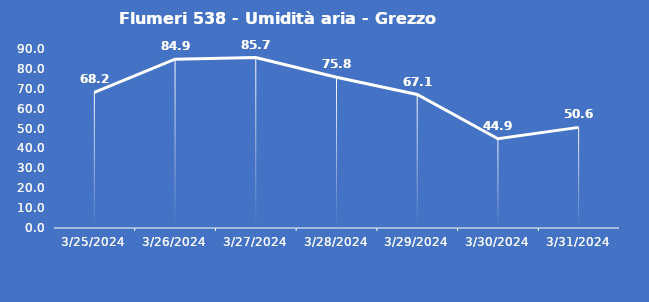
| Category | Flumeri 538 - Umidità aria - Grezzo (%) |
|---|---|
| 3/25/24 | 68.2 |
| 3/26/24 | 84.9 |
| 3/27/24 | 85.7 |
| 3/28/24 | 75.8 |
| 3/29/24 | 67.1 |
| 3/30/24 | 44.9 |
| 3/31/24 | 50.6 |